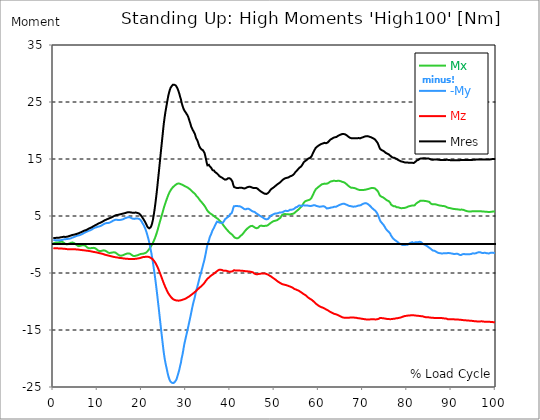
| Category |  Mx |  -My |  Mz |  Mres |
|---|---|---|---|---|
| 0.0 | 0.24 | 0.785 | -0.632 | 1.134 |
| 0.167348456675344 | 0.262 | 0.785 | -0.632 | 1.134 |
| 0.334696913350688 | 0.283 | 0.763 | -0.654 | 1.134 |
| 0.5020453700260321 | 0.327 | 0.741 | -0.654 | 1.134 |
| 0.669393826701376 | 0.371 | 0.763 | -0.654 | 1.177 |
| 0.83674228337672 | 0.371 | 0.763 | -0.654 | 1.177 |
| 1.0040907400520642 | 0.349 | 0.763 | -0.676 | 1.177 |
| 1.1621420602454444 | 0.371 | 0.741 | -0.676 | 1.177 |
| 1.3294905169207885 | 0.414 | 0.741 | -0.698 | 1.199 |
| 1.4968389735961325 | 0.458 | 0.741 | -0.698 | 1.221 |
| 1.6641874302714765 | 0.48 | 0.763 | -0.698 | 1.265 |
| 1.8315358869468206 | 0.48 | 0.763 | -0.719 | 1.265 |
| 1.9988843436221646 | 0.48 | 0.807 | -0.719 | 1.308 |
| 2.1662328002975086 | 0.414 | 0.85 | -0.741 | 1.33 |
| 2.333581256972853 | 0.327 | 0.894 | -0.741 | 1.352 |
| 2.5009297136481967 | 0.218 | 0.916 | -0.763 | 1.352 |
| 2.6682781703235405 | 0.131 | 0.916 | -0.763 | 1.33 |
| 2.8356266269988843 | 0.044 | 0.938 | -0.785 | 1.352 |
| 3.002975083674229 | 0.022 | 0.959 | -0.807 | 1.352 |
| 3.1703235403495724 | 0.022 | 0.959 | -0.807 | 1.395 |
| 3.337671997024917 | 0.065 | 0.981 | -0.829 | 1.417 |
| 3.4957233172182973 | 0.131 | 0.981 | -0.829 | 1.461 |
| 3.663071773893641 | 0.196 | 1.025 | -0.85 | 1.504 |
| 3.8304202305689854 | 0.262 | 1.047 | -0.85 | 1.548 |
| 3.997768687244329 | 0.305 | 1.09 | -0.85 | 1.592 |
| 4.165117143919673 | 0.327 | 1.156 | -0.85 | 1.635 |
| 4.332465600595017 | 0.349 | 1.221 | -0.85 | 1.679 |
| 4.499814057270361 | 0.327 | 1.265 | -0.85 | 1.701 |
| 4.667162513945706 | 0.262 | 1.308 | -0.829 | 1.722 |
| 4.834510970621049 | 0.196 | 1.374 | -0.829 | 1.744 |
| 5.001859427296393 | 0.087 | 1.417 | -0.85 | 1.788 |
| 5.169207883971737 | -0.022 | 1.483 | -0.85 | 1.81 |
| 5.336556340647081 | -0.131 | 1.526 | -0.872 | 1.875 |
| 5.503904797322425 | -0.218 | 1.548 | -0.872 | 1.897 |
| 5.671253253997769 | -0.283 | 1.592 | -0.894 | 1.962 |
| 5.82930457419115 | -0.283 | 1.613 | -0.916 | 2.006 |
| 5.996653030866494 | -0.24 | 1.657 | -0.938 | 2.071 |
| 6.164001487541838 | -0.218 | 1.722 | -0.959 | 2.115 |
| 6.331349944217181 | -0.174 | 1.766 | -0.959 | 2.18 |
| 6.498698400892526 | -0.131 | 1.831 | -0.981 | 2.246 |
| 6.66604685756787 | -0.109 | 1.897 | -1.003 | 2.311 |
| 6.833395314243213 | -0.131 | 1.984 | -1.003 | 2.377 |
| 7.000743770918558 | -0.131 | 2.049 | -1.025 | 2.442 |
| 7.168092227593902 | -0.218 | 2.115 | -1.047 | 2.486 |
| 7.335440684269246 | -0.283 | 2.18 | -1.068 | 2.507 |
| 7.50278914094459 | -0.414 | 2.246 | -1.068 | 2.573 |
| 7.6701375976199335 | -0.523 | 2.289 | -1.09 | 2.638 |
| 7.837486054295278 | -0.61 | 2.377 | -1.112 | 2.725 |
| 7.995537374488658 | -0.676 | 2.42 | -1.134 | 2.791 |
| 8.162885831164003 | -0.719 | 2.442 | -1.156 | 2.856 |
| 8.330234287839346 | -0.676 | 2.486 | -1.177 | 2.9 |
| 8.49758274451469 | -0.632 | 2.529 | -1.199 | 2.922 |
| 8.664931201190035 | -0.61 | 2.616 | -1.221 | 3.009 |
| 8.832279657865378 | -0.589 | 2.704 | -1.243 | 3.096 |
| 8.999628114540721 | -0.589 | 2.791 | -1.286 | 3.183 |
| 9.166976571216066 | -0.61 | 2.878 | -1.308 | 3.27 |
| 9.334325027891412 | -0.61 | 2.943 | -1.33 | 3.314 |
| 9.501673484566755 | -0.676 | 2.965 | -1.352 | 3.379 |
| 9.669021941242098 | -0.763 | 3.009 | -1.374 | 3.445 |
| 9.836370397917442 | -0.894 | 3.052 | -1.395 | 3.532 |
| 10.003718854592787 | -0.981 | 3.096 | -1.439 | 3.597 |
| 10.17106731126813 | -1.068 | 3.118 | -1.461 | 3.663 |
| 10.329118631461512 | -1.134 | 3.161 | -1.504 | 3.728 |
| 10.496467088136853 | -1.177 | 3.205 | -1.526 | 3.794 |
| 10.663815544812199 | -1.156 | 3.249 | -1.548 | 3.837 |
| 10.831164001487544 | -1.134 | 3.314 | -1.592 | 3.903 |
| 10.998512458162887 | -1.09 | 3.379 | -1.613 | 3.968 |
| 11.16586091483823 | -1.047 | 3.467 | -1.657 | 4.034 |
| 11.333209371513574 | -1.025 | 3.554 | -1.701 | 4.121 |
| 11.50055782818892 | -1.025 | 3.619 | -1.744 | 4.186 |
| 11.667906284864264 | -1.068 | 3.685 | -1.788 | 4.273 |
| 11.835254741539607 | -1.112 | 3.728 | -1.81 | 4.339 |
| 12.00260319821495 | -1.199 | 3.75 | -1.853 | 4.382 |
| 12.169951654890292 | -1.308 | 3.75 | -1.875 | 4.448 |
| 12.337300111565641 | -1.395 | 3.772 | -1.919 | 4.491 |
| 12.504648568240984 | -1.439 | 3.794 | -1.94 | 4.535 |
| 12.662699888434362 | -1.483 | 3.815 | -1.984 | 4.6 |
| 12.830048345109708 | -1.483 | 3.881 | -2.028 | 4.666 |
| 12.997396801785053 | -1.461 | 3.946 | -2.049 | 4.709 |
| 13.164745258460396 | -1.439 | 4.012 | -2.071 | 4.775 |
| 13.33209371513574 | -1.395 | 4.099 | -2.115 | 4.84 |
| 13.499442171811083 | -1.374 | 4.186 | -2.137 | 4.927 |
| 13.666790628486426 | -1.374 | 4.23 | -2.18 | 4.971 |
| 13.834139085161771 | -1.374 | 4.295 | -2.202 | 5.058 |
| 14.001487541837117 | -1.395 | 4.339 | -2.224 | 5.102 |
| 14.16883599851246 | -1.504 | 4.361 | -2.246 | 5.145 |
| 14.336184455187803 | -1.592 | 4.339 | -2.267 | 5.167 |
| 14.503532911863147 | -1.701 | 4.317 | -2.289 | 5.189 |
| 14.670881368538492 | -1.788 | 4.295 | -2.311 | 5.211 |
| 14.828932688731873 | -1.875 | 4.273 | -2.333 | 5.233 |
| 14.996281145407215 | -1.94 | 4.295 | -2.355 | 5.276 |
| 15.163629602082558 | -1.984 | 4.339 | -2.355 | 5.342 |
| 15.330978058757903 | -1.962 | 4.339 | -2.377 | 5.342 |
| 15.498326515433247 | -1.94 | 4.361 | -2.398 | 5.363 |
| 15.665674972108594 | -1.897 | 4.404 | -2.42 | 5.407 |
| 15.833023428783937 | -1.853 | 4.47 | -2.442 | 5.429 |
| 16.00037188545928 | -1.788 | 4.535 | -2.464 | 5.472 |
| 16.167720342134626 | -1.722 | 4.579 | -2.464 | 5.516 |
| 16.335068798809967 | -1.679 | 4.644 | -2.486 | 5.538 |
| 16.502417255485312 | -1.635 | 4.688 | -2.507 | 5.582 |
| 16.669765712160658 | -1.592 | 4.731 | -2.507 | 5.625 |
| 16.837114168836 | -1.57 | 4.775 | -2.529 | 5.647 |
| 17.004462625511344 | -1.57 | 4.797 | -2.529 | 5.669 |
| 17.16251394570472 | -1.57 | 4.797 | -2.529 | 5.669 |
| 17.32986240238007 | -1.613 | 4.753 | -2.529 | 5.647 |
| 17.497210859055414 | -1.701 | 4.688 | -2.529 | 5.625 |
| 17.664559315730756 | -1.81 | 4.622 | -2.529 | 5.603 |
| 17.8319077724061 | -1.897 | 4.579 | -2.529 | 5.582 |
| 17.999256229081443 | -1.984 | 4.513 | -2.529 | 5.56 |
| 18.166604685756788 | -2.049 | 4.47 | -2.529 | 5.56 |
| 18.333953142432133 | -2.028 | 4.491 | -2.529 | 5.582 |
| 18.501301599107478 | -2.006 | 4.535 | -2.507 | 5.582 |
| 18.668650055782823 | -1.962 | 4.579 | -2.507 | 5.603 |
| 18.835998512458165 | -1.94 | 4.557 | -2.486 | 5.56 |
| 19.00334696913351 | -1.897 | 4.557 | -2.464 | 5.538 |
| 19.170695425808855 | -1.831 | 4.579 | -2.442 | 5.516 |
| 19.338043882484197 | -1.788 | 4.513 | -2.42 | 5.451 |
| 19.496095202677576 | -1.744 | 4.47 | -2.377 | 5.385 |
| 19.66344365935292 | -1.679 | 4.339 | -2.355 | 5.233 |
| 19.830792116028263 | -1.635 | 4.186 | -2.311 | 5.08 |
| 19.998140572703612 | -1.635 | 3.968 | -2.267 | 4.884 |
| 20.165489029378953 | -1.613 | 3.728 | -2.246 | 4.688 |
| 20.3328374860543 | -1.613 | 3.51 | -2.202 | 4.491 |
| 20.500185942729644 | -1.57 | 3.27 | -2.18 | 4.273 |
| 20.667534399404985 | -1.526 | 2.987 | -2.18 | 4.055 |
| 20.83488285608033 | -1.461 | 2.66 | -2.158 | 3.815 |
| 21.002231312755672 | -1.395 | 2.289 | -2.137 | 3.554 |
| 21.16957976943102 | -1.265 | 1.875 | -2.137 | 3.27 |
| 21.336928226106362 | -1.134 | 1.417 | -2.137 | 3.031 |
| 21.504276682781704 | -0.981 | 0.938 | -2.18 | 2.878 |
| 21.67162513945705 | -0.807 | 0.392 | -2.202 | 2.834 |
| 21.82967645965043 | -0.61 | -0.218 | -2.267 | 2.9 |
| 21.997024916325774 | -0.414 | -0.872 | -2.333 | 3.031 |
| 22.16437337300112 | -0.196 | -1.548 | -2.398 | 3.292 |
| 22.33172182967646 | 0.044 | -2.311 | -2.507 | 3.728 |
| 22.499070286351806 | 0.283 | -3.096 | -2.638 | 4.295 |
| 22.666418743027148 | 0.567 | -3.968 | -2.769 | 5.036 |
| 22.833767199702496 | 0.872 | -4.862 | -2.943 | 5.865 |
| 23.00111565637784 | 1.199 | -5.821 | -3.14 | 6.802 |
| 23.168464113053183 | 1.548 | -6.802 | -3.358 | 7.827 |
| 23.335812569728528 | 1.94 | -7.871 | -3.597 | 8.917 |
| 23.50316102640387 | 2.355 | -8.961 | -3.859 | 10.095 |
| 23.670509483079215 | 2.813 | -10.116 | -4.164 | 11.359 |
| 23.83785793975456 | 3.292 | -11.228 | -4.47 | 12.58 |
| 23.995909259947936 | 3.75 | -12.428 | -4.818 | 13.867 |
| 24.163257716623285 | 4.208 | -13.583 | -5.145 | 15.153 |
| 24.330606173298627 | 4.666 | -14.76 | -5.494 | 16.461 |
| 24.49795462997397 | 5.102 | -15.894 | -5.843 | 17.704 |
| 24.665303086649313 | 5.538 | -17.006 | -6.192 | 18.947 |
| 24.83265154332466 | 6.018 | -18.14 | -6.541 | 20.233 |
| 25.0 | 6.475 | -19.165 | -6.89 | 21.389 |
| 25.167348456675345 | 6.89 | -20.015 | -7.195 | 22.37 |
| 25.334696913350694 | 7.282 | -20.734 | -7.5 | 23.242 |
| 25.502045370026035 | 7.653 | -21.345 | -7.784 | 23.983 |
| 25.669393826701377 | 8.023 | -21.934 | -8.067 | 24.724 |
| 25.836742283376722 | 8.372 | -22.544 | -8.329 | 25.466 |
| 26.004090740052067 | 8.721 | -23.089 | -8.568 | 26.142 |
| 26.17143919672741 | 9.005 | -23.503 | -8.765 | 26.665 |
| 26.329490516920792 | 9.266 | -23.83 | -8.961 | 27.123 |
| 26.49683897359613 | 9.506 | -24.07 | -9.135 | 27.472 |
| 26.66418743027148 | 9.702 | -24.179 | -9.288 | 27.69 |
| 26.831535886946828 | 9.877 | -24.266 | -9.419 | 27.864 |
| 26.998884343622166 | 10.029 | -24.31 | -9.55 | 28.017 |
| 27.166232800297514 | 10.16 | -24.31 | -9.615 | 28.104 |
| 27.333581256972852 | 10.269 | -24.179 | -9.702 | 28.038 |
| 27.5009297136482 | 10.378 | -24.07 | -9.746 | 28.017 |
| 27.668278170323543 | 10.487 | -23.874 | -9.789 | 27.908 |
| 27.835626626998888 | 10.596 | -23.678 | -9.811 | 27.799 |
| 28.002975083674233 | 10.662 | -23.242 | -9.833 | 27.493 |
| 28.170323540349575 | 10.705 | -22.828 | -9.855 | 27.166 |
| 28.33767199702492 | 10.705 | -22.37 | -9.855 | 26.796 |
| 28.50502045370026 | 10.683 | -21.89 | -9.833 | 26.403 |
| 28.663071773893645 | 10.64 | -21.28 | -9.811 | 25.902 |
| 28.830420230568986 | 10.618 | -20.778 | -9.768 | 25.487 |
| 28.99776868724433 | 10.531 | -19.993 | -9.746 | 24.877 |
| 29.165117143919673 | 10.487 | -19.426 | -9.702 | 24.441 |
| 29.33246560059502 | 10.422 | -18.729 | -9.659 | 24.027 |
| 29.499814057270367 | 10.335 | -17.944 | -9.615 | 23.678 |
| 29.66716251394571 | 10.247 | -17.268 | -9.571 | 23.46 |
| 29.834510970621054 | 10.204 | -16.701 | -9.506 | 23.351 |
| 30.00185942729639 | 10.138 | -16.134 | -9.441 | 23.067 |
| 30.169207883971744 | 10.095 | -15.567 | -9.353 | 22.893 |
| 30.33655634064708 | 10.007 | -14.979 | -9.288 | 22.653 |
| 30.50390479732243 | 9.92 | -14.412 | -9.223 | 22.37 |
| 30.671253253997772 | 9.811 | -13.801 | -9.135 | 21.955 |
| 30.829304574191156 | 9.724 | -13.212 | -9.048 | 21.541 |
| 30.996653030866494 | 9.615 | -12.602 | -8.939 | 21.149 |
| 31.164001487541842 | 9.484 | -11.97 | -8.852 | 20.691 |
| 31.331349944217187 | 9.353 | -11.337 | -8.743 | 20.407 |
| 31.498698400892525 | 9.223 | -10.705 | -8.656 | 20.124 |
| 31.666046857567874 | 9.114 | -10.16 | -8.547 | 19.884 |
| 31.833395314243212 | 9.005 | -9.68 | -8.438 | 19.732 |
| 32.00074377091856 | 8.896 | -9.157 | -8.329 | 19.404 |
| 32.1680922275939 | 8.721 | -8.525 | -8.22 | 18.925 |
| 32.33544068426925 | 8.547 | -7.958 | -8.111 | 18.554 |
| 32.50278914094459 | 8.438 | -7.566 | -7.98 | 18.358 |
| 32.670137597619934 | 8.285 | -7.086 | -7.849 | 18.031 |
| 32.83748605429528 | 8.089 | -6.563 | -7.74 | 17.617 |
| 33.004834510970625 | 7.936 | -6.018 | -7.609 | 17.246 |
| 33.162885831164004 | 7.74 | -5.538 | -7.5 | 16.984 |
| 33.33023428783935 | 7.566 | -5.102 | -7.391 | 16.832 |
| 33.497582744514695 | 7.435 | -4.622 | -7.282 | 16.679 |
| 33.664931201190036 | 7.282 | -4.121 | -7.151 | 16.592 |
| 33.83227965786538 | 7.13 | -3.619 | -7.02 | 16.527 |
| 33.99962811454073 | 6.977 | -3.14 | -6.89 | 16.439 |
| 34.16697657121607 | 6.802 | -2.616 | -6.715 | 16.069 |
| 34.33432502789141 | 6.628 | -2.028 | -6.541 | 15.589 |
| 34.50167348456676 | 6.388 | -1.352 | -6.345 | 15 |
| 34.6690219412421 | 6.148 | -0.654 | -6.17 | 14.346 |
| 34.83637039791744 | 5.93 | -0.065 | -6.018 | 13.888 |
| 35.00371885459279 | 5.8 | 0.327 | -5.909 | 13.91 |
| 35.17106731126814 | 5.647 | 0.698 | -5.8 | 13.976 |
| 35.338415767943474 | 5.494 | 1.199 | -5.669 | 13.736 |
| 35.49646708813686 | 5.429 | 1.526 | -5.56 | 13.583 |
| 35.6638155448122 | 5.407 | 1.81 | -5.472 | 13.474 |
| 35.831164001487544 | 5.276 | 2.158 | -5.363 | 13.256 |
| 35.998512458162885 | 5.167 | 2.507 | -5.276 | 13.038 |
| 36.165860914838234 | 5.08 | 2.725 | -5.189 | 13.016 |
| 36.333209371513576 | 4.971 | 2.965 | -5.102 | 12.973 |
| 36.50055782818892 | 4.862 | 3.27 | -4.993 | 12.755 |
| 36.667906284864266 | 4.775 | 3.532 | -4.884 | 12.624 |
| 36.83525474153961 | 4.688 | 3.794 | -4.775 | 12.558 |
| 37.002603198214956 | 4.622 | 4.012 | -4.666 | 12.471 |
| 37.1699516548903 | 4.513 | 4.012 | -4.579 | 12.34 |
| 37.337300111565646 | 4.404 | 3.925 | -4.47 | 12.166 |
| 37.50464856824098 | 4.273 | 3.859 | -4.426 | 12.035 |
| 37.66269988843437 | 4.143 | 3.815 | -4.426 | 11.926 |
| 37.83004834510971 | 4.012 | 3.772 | -4.426 | 11.839 |
| 37.99739680178505 | 3.859 | 3.794 | -4.448 | 11.795 |
| 38.16474525846039 | 3.685 | 3.772 | -4.491 | 11.708 |
| 38.33209371513574 | 3.51 | 3.837 | -4.557 | 11.621 |
| 38.49944217181109 | 3.314 | 3.99 | -4.6 | 11.512 |
| 38.666790628486424 | 3.14 | 4.208 | -4.6 | 11.403 |
| 38.83413908516178 | 2.987 | 4.448 | -4.579 | 11.381 |
| 39.001487541837115 | 2.834 | 4.6 | -4.579 | 11.403 |
| 39.16883599851246 | 2.66 | 4.644 | -4.622 | 11.425 |
| 39.336184455187805 | 2.529 | 4.753 | -4.644 | 11.512 |
| 39.503532911863154 | 2.377 | 4.84 | -4.709 | 11.621 |
| 39.670881368538495 | 2.202 | 4.971 | -4.753 | 11.664 |
| 39.83822982521384 | 2.093 | 5.145 | -4.775 | 11.621 |
| 39.996281145407224 | 1.984 | 5.342 | -4.753 | 11.534 |
| 40.163629602082565 | 1.875 | 5.451 | -4.753 | 11.446 |
| 40.33097805875791 | 1.766 | 5.516 | -4.731 | 11.316 |
| 40.498326515433256 | 1.679 | 5.909 | -4.709 | 11.01 |
| 40.6656749721086 | 1.483 | 6.41 | -4.6 | 10.487 |
| 40.83302342878393 | 1.308 | 6.715 | -4.513 | 10.116 |
| 41.00037188545929 | 1.221 | 6.737 | -4.513 | 10.007 |
| 41.16772034213463 | 1.177 | 6.737 | -4.557 | 9.986 |
| 41.33506879880997 | 1.112 | 6.737 | -4.557 | 9.942 |
| 41.50241725548531 | 1.047 | 6.759 | -4.557 | 9.898 |
| 41.66976571216066 | 1.09 | 6.737 | -4.557 | 9.877 |
| 41.837114168836 | 1.134 | 6.715 | -4.579 | 9.92 |
| 42.004462625511344 | 1.243 | 6.737 | -4.579 | 9.942 |
| 42.17181108218669 | 1.374 | 6.693 | -4.579 | 9.964 |
| 42.32986240238007 | 1.526 | 6.606 | -4.6 | 9.964 |
| 42.497210859055414 | 1.57 | 6.584 | -4.6 | 9.964 |
| 42.66455931573076 | 1.722 | 6.497 | -4.622 | 9.92 |
| 42.831907772406105 | 1.875 | 6.41 | -4.622 | 9.898 |
| 42.999256229081446 | 2.028 | 6.301 | -4.622 | 9.855 |
| 43.16660468575679 | 2.202 | 6.214 | -4.644 | 9.833 |
| 43.33395314243214 | 2.377 | 6.127 | -4.666 | 9.833 |
| 43.50130159910748 | 2.529 | 6.17 | -4.688 | 9.898 |
| 43.66865005578282 | 2.66 | 6.236 | -4.688 | 9.964 |
| 43.83599851245817 | 2.791 | 6.279 | -4.709 | 10.051 |
| 44.00334696913351 | 2.9 | 6.301 | -4.731 | 10.116 |
| 44.17069542580886 | 3.009 | 6.257 | -4.731 | 10.116 |
| 44.3380438824842 | 3.096 | 6.17 | -4.753 | 10.095 |
| 44.49609520267758 | 3.183 | 6.105 | -4.775 | 10.116 |
| 44.66344365935292 | 3.249 | 6.018 | -4.797 | 10.095 |
| 44.83079211602827 | 3.249 | 5.909 | -4.818 | 10.029 |
| 44.99814057270361 | 3.27 | 5.821 | -4.862 | 9.964 |
| 45.16548902937895 | 3.227 | 5.778 | -4.906 | 9.92 |
| 45.332837486054295 | 3.096 | 5.756 | -5.015 | 9.898 |
| 45.500185942729644 | 2.987 | 5.712 | -5.124 | 9.92 |
| 45.66753439940499 | 2.922 | 5.625 | -5.189 | 9.942 |
| 45.83488285608033 | 2.856 | 5.494 | -5.211 | 9.92 |
| 46.00223131275568 | 2.856 | 5.385 | -5.233 | 9.833 |
| 46.16957976943102 | 2.856 | 5.32 | -5.211 | 9.789 |
| 46.336928226106366 | 2.965 | 5.233 | -5.189 | 9.68 |
| 46.50427668278171 | 3.118 | 5.145 | -5.167 | 9.55 |
| 46.671625139457056 | 3.249 | 5.058 | -5.145 | 9.462 |
| 46.829676459650436 | 3.314 | 4.971 | -5.124 | 9.353 |
| 46.99702491632577 | 3.314 | 4.862 | -5.102 | 9.244 |
| 47.16437337300112 | 3.249 | 4.84 | -5.08 | 9.179 |
| 47.33172182967646 | 3.249 | 4.753 | -5.08 | 9.092 |
| 47.49907028635181 | 3.249 | 4.666 | -5.08 | 9.026 |
| 47.66641874302716 | 3.249 | 4.579 | -5.08 | 8.961 |
| 47.83376719970249 | 3.27 | 4.491 | -5.102 | 8.896 |
| 48.001115656377834 | 3.292 | 4.426 | -5.124 | 8.852 |
| 48.16846411305319 | 3.314 | 4.404 | -5.167 | 8.874 |
| 48.33581256972853 | 3.314 | 4.426 | -5.211 | 8.917 |
| 48.50316102640387 | 3.401 | 4.47 | -5.276 | 9.005 |
| 48.67050948307921 | 3.488 | 4.557 | -5.363 | 9.114 |
| 48.837857939754564 | 3.597 | 4.731 | -5.429 | 9.288 |
| 49.005206396429905 | 3.706 | 4.906 | -5.516 | 9.462 |
| 49.163257716623285 | 3.815 | 5.08 | -5.582 | 9.659 |
| 49.33060617329863 | 3.881 | 5.145 | -5.669 | 9.768 |
| 49.49795462997397 | 3.946 | 5.189 | -5.778 | 9.855 |
| 49.66530308664932 | 4.055 | 5.298 | -5.865 | 9.942 |
| 49.832651543324666 | 4.121 | 5.342 | -5.952 | 10.029 |
| 50.0 | 4.143 | 5.363 | -6.039 | 10.138 |
| 50.16734845667534 | 4.208 | 5.429 | -6.127 | 10.247 |
| 50.33469691335069 | 4.208 | 5.451 | -6.236 | 10.356 |
| 50.50204537002604 | 4.23 | 5.451 | -6.345 | 10.465 |
| 50.66939382670139 | 4.295 | 5.472 | -6.454 | 10.574 |
| 50.836742283376715 | 4.426 | 5.516 | -6.541 | 10.662 |
| 51.00409074005207 | 4.513 | 5.494 | -6.628 | 10.749 |
| 51.17143919672741 | 4.6 | 5.625 | -6.693 | 10.836 |
| 51.32949051692079 | 4.688 | 5.734 | -6.759 | 10.945 |
| 51.496838973596134 | 4.927 | 5.625 | -6.846 | 11.076 |
| 51.66418743027148 | 5.145 | 5.625 | -6.911 | 11.25 |
| 51.831535886946824 | 5.233 | 5.669 | -6.977 | 11.337 |
| 51.99888434362217 | 5.298 | 5.734 | -7.02 | 11.425 |
| 52.16623280029752 | 5.32 | 5.821 | -7.042 | 11.512 |
| 52.33358125697285 | 5.342 | 5.865 | -7.086 | 11.577 |
| 52.5009297136482 | 5.342 | 5.93 | -7.108 | 11.643 |
| 52.668278170323546 | 5.32 | 5.909 | -7.13 | 11.686 |
| 52.835626626998895 | 5.298 | 5.865 | -7.173 | 11.708 |
| 53.00297508367424 | 5.298 | 5.865 | -7.239 | 11.73 |
| 53.17032354034958 | 5.276 | 5.909 | -7.282 | 11.774 |
| 53.33767199702492 | 5.276 | 6.018 | -7.348 | 11.883 |
| 53.50502045370027 | 5.298 | 6.083 | -7.369 | 11.948 |
| 53.663071773893655 | 5.32 | 6.105 | -7.413 | 11.992 |
| 53.83042023056899 | 5.342 | 6.105 | -7.478 | 12.035 |
| 53.99776868724433 | 5.363 | 6.127 | -7.522 | 12.101 |
| 54.16511714391967 | 5.385 | 6.148 | -7.609 | 12.188 |
| 54.33246560059503 | 5.429 | 6.214 | -7.718 | 12.297 |
| 54.49981405727037 | 5.516 | 6.301 | -7.805 | 12.449 |
| 54.667162513945705 | 5.647 | 6.432 | -7.849 | 12.646 |
| 54.834510970621054 | 5.778 | 6.519 | -7.893 | 12.798 |
| 55.0018594272964 | 5.865 | 6.541 | -7.958 | 12.907 |
| 55.169207883971744 | 5.974 | 6.606 | -8.002 | 13.016 |
| 55.336556340647086 | 6.083 | 6.759 | -8.045 | 13.212 |
| 55.50390479732243 | 6.192 | 6.824 | -8.111 | 13.343 |
| 55.671253253997776 | 6.323 | 6.868 | -8.198 | 13.496 |
| 55.83860171067312 | 6.454 | 6.824 | -8.285 | 13.605 |
| 55.9966530308665 | 6.584 | 6.737 | -8.35 | 13.67 |
| 56.16400148754184 | 6.759 | 6.715 | -8.459 | 13.823 |
| 56.33134994421718 | 6.933 | 6.824 | -8.568 | 14.041 |
| 56.498698400892536 | 7.151 | 6.89 | -8.656 | 14.281 |
| 56.66604685756788 | 7.369 | 6.911 | -8.743 | 14.477 |
| 56.83339531424321 | 7.5 | 6.846 | -8.808 | 14.564 |
| 57.00074377091856 | 7.609 | 6.846 | -8.896 | 14.673 |
| 57.16809222759391 | 7.675 | 6.846 | -8.983 | 14.76 |
| 57.33544068426925 | 7.696 | 6.824 | -9.092 | 14.869 |
| 57.5027891409446 | 7.696 | 6.824 | -9.244 | 14.957 |
| 57.670137597619934 | 7.784 | 6.846 | -9.332 | 15.088 |
| 57.83748605429528 | 7.827 | 6.781 | -9.419 | 15.131 |
| 58.004834510970625 | 7.871 | 6.737 | -9.528 | 15.175 |
| 58.16288583116401 | 7.936 | 6.737 | -9.593 | 15.284 |
| 58.330234287839346 | 8.132 | 6.737 | -9.637 | 15.436 |
| 58.497582744514695 | 8.394 | 6.802 | -9.746 | 15.698 |
| 58.66493120119004 | 8.656 | 6.868 | -9.877 | 15.981 |
| 58.832279657865385 | 8.939 | 6.89 | -9.986 | 16.243 |
| 58.999628114540734 | 9.223 | 6.868 | -10.095 | 16.505 |
| 59.16697657121607 | 9.462 | 6.868 | -10.226 | 16.745 |
| 59.33432502789142 | 9.702 | 6.802 | -10.356 | 16.963 |
| 59.50167348456676 | 9.811 | 6.759 | -10.465 | 17.072 |
| 59.66902194124211 | 9.92 | 6.737 | -10.574 | 17.181 |
| 59.83637039791745 | 10.029 | 6.693 | -10.662 | 17.29 |
| 60.00371885459278 | 10.138 | 6.65 | -10.771 | 17.377 |
| 60.17106731126813 | 10.226 | 6.628 | -10.836 | 17.442 |
| 60.33841576794349 | 10.335 | 6.65 | -10.901 | 17.529 |
| 60.49646708813685 | 10.487 | 6.65 | -10.967 | 17.595 |
| 60.6638155448122 | 10.553 | 6.672 | -11.01 | 17.66 |
| 60.831164001487544 | 10.596 | 6.693 | -11.054 | 17.704 |
| 60.99851245816289 | 10.618 | 6.715 | -11.098 | 17.747 |
| 61.16586091483824 | 10.662 | 6.693 | -11.163 | 17.791 |
| 61.333209371513576 | 10.683 | 6.672 | -11.25 | 17.835 |
| 61.50055782818892 | 10.662 | 6.563 | -11.316 | 17.791 |
| 61.667906284864266 | 10.662 | 6.388 | -11.381 | 17.769 |
| 61.835254741539615 | 10.683 | 6.323 | -11.446 | 17.813 |
| 62.002603198214956 | 10.705 | 6.323 | -11.512 | 17.878 |
| 62.16995165489029 | 10.814 | 6.366 | -11.599 | 18.031 |
| 62.33730011156564 | 10.88 | 6.366 | -11.686 | 18.14 |
| 62.504648568240995 | 10.945 | 6.41 | -11.774 | 18.271 |
| 62.67199702491633 | 11.054 | 6.475 | -11.839 | 18.423 |
| 62.83004834510971 | 11.076 | 6.497 | -11.904 | 18.489 |
| 62.99739680178505 | 11.098 | 6.497 | -11.97 | 18.554 |
| 63.1647452584604 | 11.141 | 6.519 | -12.035 | 18.641 |
| 63.33209371513575 | 11.185 | 6.606 | -12.101 | 18.729 |
| 63.4994421718111 | 11.185 | 6.628 | -12.166 | 18.794 |
| 63.666790628486424 | 11.163 | 6.628 | -12.188 | 18.816 |
| 63.83413908516177 | 11.119 | 6.606 | -12.231 | 18.816 |
| 64.00148754183712 | 11.119 | 6.628 | -12.275 | 18.859 |
| 64.16883599851248 | 11.141 | 6.715 | -12.319 | 18.947 |
| 64.3361844551878 | 11.185 | 6.824 | -12.362 | 19.056 |
| 64.50353291186315 | 11.185 | 6.868 | -12.449 | 19.143 |
| 64.6708813685385 | 11.163 | 6.933 | -12.515 | 19.186 |
| 64.83822982521384 | 11.119 | 6.977 | -12.58 | 19.23 |
| 65.00557828188919 | 11.098 | 7.02 | -12.646 | 19.295 |
| 65.16362960208257 | 11.054 | 7.086 | -12.711 | 19.339 |
| 65.3309780587579 | 10.989 | 7.13 | -12.776 | 19.383 |
| 65.49832651543326 | 10.945 | 7.151 | -12.82 | 19.404 |
| 65.6656749721086 | 10.923 | 7.151 | -12.842 | 19.383 |
| 65.83302342878395 | 10.836 | 7.13 | -12.842 | 19.361 |
| 66.00037188545929 | 10.771 | 7.108 | -12.864 | 19.317 |
| 66.16772034213463 | 10.662 | 7.02 | -12.864 | 19.23 |
| 66.33506879880998 | 10.553 | 6.977 | -12.864 | 19.143 |
| 66.50241725548531 | 10.422 | 6.911 | -12.864 | 19.034 |
| 66.66976571216065 | 10.313 | 6.868 | -12.864 | 18.947 |
| 66.83711416883601 | 10.204 | 6.781 | -12.864 | 18.838 |
| 67.00446262551135 | 10.116 | 6.737 | -12.842 | 18.75 |
| 67.1718110821867 | 10.029 | 6.737 | -12.798 | 18.685 |
| 67.32986240238007 | 9.964 | 6.715 | -12.798 | 18.663 |
| 67.49721085905541 | 9.964 | 6.672 | -12.798 | 18.641 |
| 67.66455931573076 | 9.942 | 6.628 | -12.798 | 18.62 |
| 67.83190777240611 | 9.92 | 6.628 | -12.798 | 18.62 |
| 67.99925622908145 | 9.92 | 6.65 | -12.82 | 18.62 |
| 68.16660468575678 | 9.877 | 6.672 | -12.842 | 18.641 |
| 68.33395314243214 | 9.833 | 6.693 | -12.842 | 18.62 |
| 68.50130159910749 | 9.768 | 6.693 | -12.864 | 18.62 |
| 68.66865005578282 | 9.702 | 6.715 | -12.885 | 18.62 |
| 68.83599851245816 | 9.659 | 6.802 | -12.929 | 18.641 |
| 69.00334696913352 | 9.615 | 6.868 | -12.951 | 18.685 |
| 69.17069542580886 | 9.593 | 6.846 | -12.951 | 18.663 |
| 69.3380438824842 | 9.55 | 6.824 | -12.951 | 18.62 |
| 69.50539233915956 | 9.528 | 6.89 | -12.994 | 18.663 |
| 69.66344365935292 | 9.55 | 6.977 | -13.016 | 18.729 |
| 69.83079211602826 | 9.528 | 7.064 | -13.038 | 18.772 |
| 69.99814057270362 | 9.55 | 7.13 | -13.06 | 18.816 |
| 70.16548902937896 | 9.571 | 7.173 | -13.082 | 18.881 |
| 70.33283748605429 | 9.593 | 7.217 | -13.125 | 18.925 |
| 70.50018594272964 | 9.593 | 7.26 | -13.125 | 18.968 |
| 70.667534399405 | 9.637 | 7.239 | -13.147 | 18.99 |
| 70.83488285608033 | 9.659 | 7.217 | -13.147 | 19.012 |
| 71.00223131275568 | 9.702 | 7.173 | -13.125 | 19.012 |
| 71.16957976943102 | 9.724 | 7.064 | -13.147 | 18.968 |
| 71.33692822610637 | 9.768 | 6.977 | -13.147 | 18.947 |
| 71.50427668278171 | 9.811 | 6.846 | -13.147 | 18.903 |
| 71.67162513945706 | 9.855 | 6.715 | -13.125 | 18.859 |
| 71.8389735961324 | 9.898 | 6.584 | -13.125 | 18.816 |
| 71.99702491632577 | 9.92 | 6.454 | -13.125 | 18.75 |
| 72.16437337300113 | 9.898 | 6.323 | -13.125 | 18.663 |
| 72.33172182967647 | 9.898 | 6.214 | -13.125 | 18.62 |
| 72.49907028635181 | 9.877 | 6.105 | -13.125 | 18.532 |
| 72.66641874302715 | 9.855 | 5.996 | -13.147 | 18.467 |
| 72.8337671997025 | 9.768 | 5.887 | -13.147 | 18.358 |
| 73.00111565637783 | 9.637 | 5.734 | -13.125 | 18.162 |
| 73.16846411305319 | 9.484 | 5.538 | -13.125 | 17.987 |
| 73.33581256972853 | 9.375 | 5.276 | -13.125 | 17.791 |
| 73.50316102640387 | 9.135 | 4.971 | -13.06 | 17.486 |
| 73.67050948307921 | 8.852 | 4.622 | -12.973 | 17.159 |
| 73.83785793975457 | 8.59 | 4.273 | -12.907 | 16.81 |
| 74.00520639642991 | 8.459 | 4.034 | -12.907 | 16.657 |
| 74.16325771662328 | 8.394 | 3.859 | -12.907 | 16.592 |
| 74.33060617329863 | 8.35 | 3.728 | -12.907 | 16.548 |
| 74.49795462997398 | 8.285 | 3.576 | -12.929 | 16.461 |
| 74.66530308664932 | 8.22 | 3.423 | -12.951 | 16.396 |
| 74.83265154332466 | 8.111 | 3.249 | -12.973 | 16.308 |
| 75.00000000000001 | 8.002 | 3.009 | -12.994 | 16.178 |
| 75.16734845667534 | 7.893 | 2.769 | -13.016 | 16.069 |
| 75.3346969133507 | 7.805 | 2.595 | -13.06 | 16.003 |
| 75.50204537002605 | 7.718 | 2.442 | -13.082 | 15.938 |
| 75.66939382670138 | 7.675 | 2.355 | -13.082 | 15.894 |
| 75.83674228337672 | 7.609 | 2.224 | -13.082 | 15.807 |
| 76.00409074005208 | 7.5 | 2.071 | -13.082 | 15.72 |
| 76.17143919672742 | 7.326 | 1.897 | -13.103 | 15.589 |
| 76.33878765340276 | 7.02 | 1.592 | -13.082 | 15.415 |
| 76.49683897359614 | 6.89 | 1.395 | -13.082 | 15.349 |
| 76.66418743027148 | 6.824 | 1.243 | -13.06 | 15.306 |
| 76.83153588694682 | 6.737 | 1.047 | -13.038 | 15.24 |
| 76.99888434362218 | 6.693 | 0.872 | -13.016 | 15.197 |
| 77.16623280029752 | 6.715 | 0.807 | -13.016 | 15.197 |
| 77.33358125697285 | 6.693 | 0.719 | -12.994 | 15.175 |
| 77.5009297136482 | 6.584 | 0.632 | -12.951 | 15.066 |
| 77.66827817032356 | 6.519 | 0.501 | -12.951 | 14.979 |
| 77.83562662699889 | 6.454 | 0.436 | -12.929 | 14.891 |
| 78.00297508367423 | 6.519 | 0.305 | -12.885 | 14.848 |
| 78.17032354034959 | 6.475 | 0.196 | -12.864 | 14.76 |
| 78.33767199702493 | 6.432 | 0.131 | -12.842 | 14.695 |
| 78.50502045370027 | 6.388 | 0.087 | -12.82 | 14.608 |
| 78.67236891037561 | 6.366 | 0.044 | -12.776 | 14.564 |
| 78.83042023056899 | 6.366 | -0.065 | -12.711 | 14.542 |
| 78.99776868724433 | 6.388 | -0.109 | -12.667 | 14.542 |
| 79.16511714391969 | 6.41 | -0.109 | -12.624 | 14.477 |
| 79.33246560059503 | 6.41 | -0.109 | -12.558 | 14.433 |
| 79.49981405727036 | 6.454 | -0.087 | -12.537 | 14.39 |
| 79.66716251394571 | 6.475 | -0.065 | -12.515 | 14.368 |
| 79.83451097062107 | 6.497 | -0.044 | -12.515 | 14.368 |
| 80.00185942729641 | 6.563 | -0.022 | -12.493 | 14.368 |
| 80.16920788397174 | 6.65 | -0.022 | -12.471 | 14.368 |
| 80.33655634064709 | 6.693 | 0.087 | -12.471 | 14.346 |
| 80.50390479732243 | 6.715 | 0.196 | -12.449 | 14.324 |
| 80.67125325399778 | 6.759 | 0.262 | -12.449 | 14.324 |
| 80.83860171067312 | 6.824 | 0.327 | -12.428 | 14.324 |
| 80.99665303086651 | 6.824 | 0.414 | -12.428 | 14.324 |
| 81.16400148754184 | 6.824 | 0.414 | -12.428 | 14.324 |
| 81.3313499442172 | 6.824 | 0.305 | -12.428 | 14.324 |
| 81.49869840089255 | 6.824 | 0.24 | -12.428 | 14.303 |
| 81.66604685756786 | 6.868 | 0.305 | -12.428 | 14.368 |
| 81.83339531424322 | 6.999 | 0.392 | -12.449 | 14.499 |
| 82.00074377091858 | 7.151 | 0.392 | -12.471 | 14.63 |
| 82.16809222759392 | 7.282 | 0.371 | -12.493 | 14.739 |
| 82.33544068426926 | 7.369 | 0.392 | -12.493 | 14.782 |
| 82.50278914094459 | 7.435 | 0.414 | -12.515 | 14.848 |
| 82.67013759761994 | 7.5 | 0.436 | -12.515 | 14.891 |
| 82.83748605429528 | 7.609 | 0.48 | -12.537 | 15.022 |
| 83.00483451097062 | 7.696 | 0.48 | -12.58 | 15.088 |
| 83.17218296764597 | 7.718 | 0.392 | -12.58 | 15.109 |
| 83.33023428783935 | 7.696 | 0.24 | -12.58 | 15.109 |
| 83.4975827445147 | 7.696 | 0.131 | -12.602 | 15.109 |
| 83.66493120119004 | 7.696 | 0.087 | -12.624 | 15.131 |
| 83.83227965786537 | 7.675 | 0 | -12.689 | 15.131 |
| 83.99962811454073 | 7.631 | -0.087 | -12.733 | 15.131 |
| 84.16697657121607 | 7.609 | -0.131 | -12.755 | 15.109 |
| 84.33432502789142 | 7.609 | -0.153 | -12.776 | 15.109 |
| 84.50167348456677 | 7.587 | -0.283 | -12.776 | 15.109 |
| 84.6690219412421 | 7.544 | -0.414 | -12.776 | 15.109 |
| 84.83637039791745 | 7.522 | -0.48 | -12.776 | 15.088 |
| 85.0037188545928 | 7.478 | -0.523 | -12.798 | 15.066 |
| 85.17106731126813 | 7.326 | -0.654 | -12.82 | 14.979 |
| 85.33841576794349 | 7.195 | -0.785 | -12.842 | 14.913 |
| 85.50576422461883 | 7.13 | -0.872 | -12.842 | 14.891 |
| 85.66381554481221 | 7.064 | -0.981 | -12.864 | 14.869 |
| 85.83116400148755 | 7.042 | -1.068 | -12.864 | 14.869 |
| 85.99851245816289 | 7.064 | -1.09 | -12.885 | 14.891 |
| 86.16586091483823 | 7.086 | -1.09 | -12.885 | 14.913 |
| 86.33320937151358 | 7.064 | -1.156 | -12.885 | 14.913 |
| 86.50055782818893 | 7.042 | -1.243 | -12.907 | 14.913 |
| 86.66790628486427 | 6.999 | -1.33 | -12.907 | 14.913 |
| 86.83525474153961 | 6.977 | -1.395 | -12.907 | 14.891 |
| 87.00260319821496 | 6.911 | -1.483 | -12.907 | 14.869 |
| 87.16995165489031 | 6.868 | -1.504 | -12.907 | 14.869 |
| 87.33730011156564 | 6.846 | -1.504 | -12.907 | 14.848 |
| 87.504648568241 | 6.824 | -1.526 | -12.907 | 14.826 |
| 87.67199702491634 | 6.802 | -1.548 | -12.907 | 14.826 |
| 87.83004834510972 | 6.759 | -1.592 | -12.907 | 14.826 |
| 87.99739680178506 | 6.759 | -1.592 | -12.929 | 14.826 |
| 88.1647452584604 | 6.759 | -1.548 | -12.951 | 14.848 |
| 88.33209371513574 | 6.737 | -1.548 | -12.951 | 14.826 |
| 88.49944217181108 | 6.693 | -1.548 | -12.973 | 14.826 |
| 88.66679062848644 | 6.672 | -1.548 | -12.973 | 14.826 |
| 88.83413908516178 | 6.628 | -1.548 | -12.994 | 14.848 |
| 89.00148754183712 | 6.519 | -1.548 | -13.06 | 14.848 |
| 89.16883599851246 | 6.475 | -1.504 | -13.103 | 14.848 |
| 89.33618445518782 | 6.432 | -1.483 | -13.125 | 14.826 |
| 89.50353291186315 | 6.41 | -1.504 | -13.125 | 14.826 |
| 89.6708813685385 | 6.388 | -1.526 | -13.125 | 14.804 |
| 89.83822982521386 | 6.366 | -1.548 | -13.125 | 14.782 |
| 90.00557828188919 | 6.323 | -1.548 | -13.125 | 14.782 |
| 90.16362960208257 | 6.279 | -1.592 | -13.125 | 14.782 |
| 90.3309780587579 | 6.257 | -1.635 | -13.125 | 14.782 |
| 90.49832651543326 | 6.257 | -1.657 | -13.125 | 14.782 |
| 90.66567497210859 | 6.236 | -1.679 | -13.125 | 14.76 |
| 90.83302342878395 | 6.214 | -1.657 | -13.147 | 14.76 |
| 91.00037188545929 | 6.192 | -1.635 | -13.147 | 14.76 |
| 91.16772034213463 | 6.192 | -1.613 | -13.147 | 14.76 |
| 91.33506879880998 | 6.17 | -1.613 | -13.169 | 14.76 |
| 91.50241725548533 | 6.148 | -1.657 | -13.169 | 14.76 |
| 91.66976571216065 | 6.127 | -1.744 | -13.169 | 14.76 |
| 91.83711416883601 | 6.105 | -1.81 | -13.191 | 14.782 |
| 92.00446262551137 | 6.105 | -1.853 | -13.212 | 14.804 |
| 92.1718110821867 | 6.105 | -1.853 | -13.212 | 14.826 |
| 92.33915953886203 | 6.127 | -1.788 | -13.234 | 14.826 |
| 92.49721085905541 | 6.105 | -1.701 | -13.256 | 14.826 |
| 92.66455931573077 | 6.083 | -1.657 | -13.256 | 14.826 |
| 92.83190777240611 | 6.039 | -1.679 | -13.278 | 14.826 |
| 92.99925622908145 | 5.996 | -1.701 | -13.278 | 14.826 |
| 93.1666046857568 | 5.93 | -1.701 | -13.3 | 14.804 |
| 93.33395314243214 | 5.887 | -1.701 | -13.322 | 14.804 |
| 93.50130159910749 | 5.865 | -1.701 | -13.322 | 14.804 |
| 93.66865005578283 | 5.821 | -1.701 | -13.343 | 14.804 |
| 93.83599851245818 | 5.8 | -1.701 | -13.343 | 14.804 |
| 94.00334696913353 | 5.8 | -1.701 | -13.365 | 14.804 |
| 94.17069542580886 | 5.778 | -1.701 | -13.365 | 14.804 |
| 94.3380438824842 | 5.778 | -1.679 | -13.387 | 14.826 |
| 94.50539233915954 | 5.8 | -1.657 | -13.387 | 14.826 |
| 94.66344365935292 | 5.821 | -1.57 | -13.409 | 14.826 |
| 94.83079211602828 | 5.843 | -1.548 | -13.409 | 14.848 |
| 94.99814057270362 | 5.843 | -1.548 | -13.431 | 14.869 |
| 95.16548902937897 | 5.843 | -1.57 | -13.452 | 14.869 |
| 95.33283748605432 | 5.821 | -1.57 | -13.452 | 14.891 |
| 95.50018594272963 | 5.821 | -1.548 | -13.474 | 14.891 |
| 95.66753439940499 | 5.821 | -1.504 | -13.474 | 14.891 |
| 95.83488285608034 | 5.821 | -1.439 | -13.496 | 14.891 |
| 96.00223131275567 | 5.843 | -1.395 | -13.496 | 14.913 |
| 96.16957976943102 | 5.843 | -1.352 | -13.496 | 14.913 |
| 96.33692822610638 | 5.821 | -1.308 | -13.518 | 14.913 |
| 96.50427668278171 | 5.821 | -1.352 | -13.496 | 14.913 |
| 96.67162513945706 | 5.843 | -1.395 | -13.474 | 14.891 |
| 96.8389735961324 | 5.8 | -1.461 | -13.474 | 14.891 |
| 96.99702491632577 | 5.778 | -1.483 | -13.496 | 14.891 |
| 97.16437337300111 | 5.756 | -1.504 | -13.518 | 14.891 |
| 97.33172182967647 | 5.778 | -1.417 | -13.518 | 14.913 |
| 97.49907028635181 | 5.756 | -1.439 | -13.54 | 14.891 |
| 97.66641874302715 | 5.756 | -1.526 | -13.518 | 14.913 |
| 97.8337671997025 | 5.756 | -1.504 | -13.54 | 14.913 |
| 98.00111565637785 | 5.734 | -1.504 | -13.54 | 14.913 |
| 98.16846411305319 | 5.734 | -1.548 | -13.54 | 14.913 |
| 98.33581256972855 | 5.712 | -1.57 | -13.54 | 14.913 |
| 98.50316102640389 | 5.712 | -1.57 | -13.54 | 14.913 |
| 98.67050948307921 | 5.712 | -1.526 | -13.561 | 14.935 |
| 98.83785793975456 | 5.734 | -1.461 | -13.583 | 14.935 |
| 99.0052063964299 | 5.734 | -1.461 | -13.605 | 14.957 |
| 99.17255485310525 | 5.734 | -1.461 | -13.605 | 14.979 |
| 99.33060617329863 | 5.778 | -1.483 | -13.605 | 15 |
| 99.49795462997399 | 5.778 | -1.461 | -13.627 | 15 |
| 99.66530308664933 | 5.778 | -1.504 | -13.649 | 15.022 |
| 99.83265154332467 | 5.778 | -1.548 | -13.649 | 15.022 |
| 100.0 | 5.778 | -1.548 | -13.649 | 15.044 |